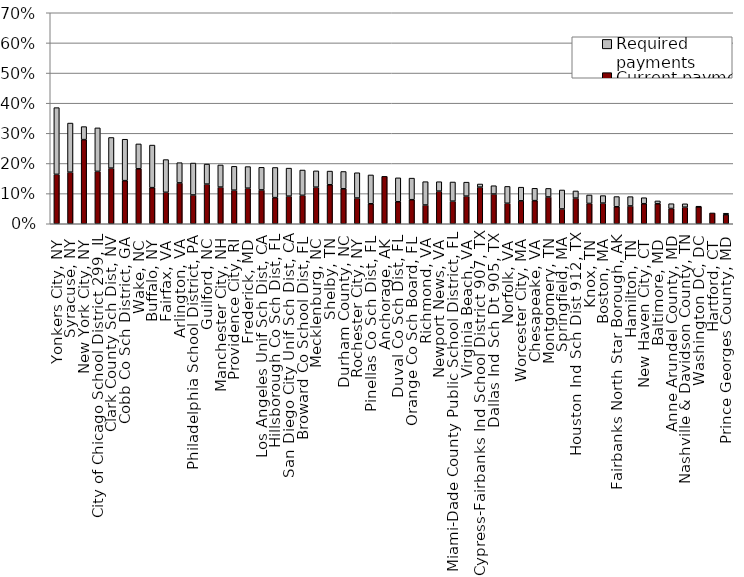
| Category | Current payments | Required payments |
|---|---|---|
| Yonkers City, NY | 0.164 | 0.221 |
| Syracuse, NY | 0.171 | 0.163 |
| New York City, NY | 0.279 | 0.043 |
| City of Chicago School District 299, IL | 0.174 | 0.144 |
| Clark County Sch Dist, NV | 0.185 | 0.102 |
| Cobb Co Sch District, GA | 0.143 | 0.137 |
| Wake, NC | 0.182 | 0.082 |
| Buffalo, NY | 0.12 | 0.141 |
| Fairfax, VA | 0.104 | 0.108 |
| Arlington, VA | 0.136 | 0.067 |
| Philadelphia School District, PA | 0.096 | 0.106 |
| Guilford, NC | 0.132 | 0.066 |
| Manchester City, NH | 0.122 | 0.073 |
| Providence City, RI | 0.111 | 0.079 |
| Frederick, MD | 0.118 | 0.072 |
| Los Angeles Unif Sch Dist, CA | 0.112 | 0.075 |
| Hillsborough Co Sch Dist, FL | 0.087 | 0.1 |
| San Diego City Unif Sch Dist, CA | 0.092 | 0.093 |
| Broward Co School Dist, FL | 0.094 | 0.084 |
| Mecklenburg, NC | 0.121 | 0.054 |
| Shelby, TN | 0.129 | 0.045 |
| Durham County, NC | 0.116 | 0.057 |
| Rochester City, NY | 0.085 | 0.084 |
| Pinellas Co Sch Dist, FL | 0.066 | 0.096 |
| Anchorage, AK | 0.157 | 0 |
| Duval Co Sch Dist, FL | 0.073 | 0.079 |
| Orange Co Sch Board, FL | 0.08 | 0.072 |
| Richmond, VA | 0.062 | 0.077 |
| Newport News, VA | 0.108 | 0.031 |
| Miami-Dade County Public School District, FL | 0.075 | 0.064 |
| Virginia Beach, VA | 0.092 | 0.046 |
| Cypress-Fairbanks Ind School District 907, TX | 0.122 | 0.01 |
| Dallas Ind Sch Dt 905, TX | 0.099 | 0.028 |
| Norfolk, VA | 0.068 | 0.056 |
| Worcester City, MA | 0.076 | 0.045 |
| Chesapeake, VA | 0.077 | 0.041 |
| Montgomery, TN | 0.089 | 0.028 |
| Springfield, MA | 0.049 | 0.063 |
| Houston Ind Sch Dist 912, TX | 0.085 | 0.024 |
| Knox, TN | 0.067 | 0.028 |
| Boston, MA | 0.068 | 0.025 |
| Fairbanks North Star Borough, AK | 0.056 | 0.034 |
| Hamilton, TN | 0.059 | 0.031 |
| New Haven City, CT | 0.067 | 0.02 |
| Baltimore, MD | 0.067 | 0.009 |
| Anne Arundel County, MD | 0.051 | 0.016 |
| Nashville & Davidson County, TN | 0.055 | 0.011 |
| Washington DC, DC | 0.057 | 0 |
| Hartford, CT | 0.036 | 0 |
| Prince Georges County, MD | 0.03 | 0.005 |